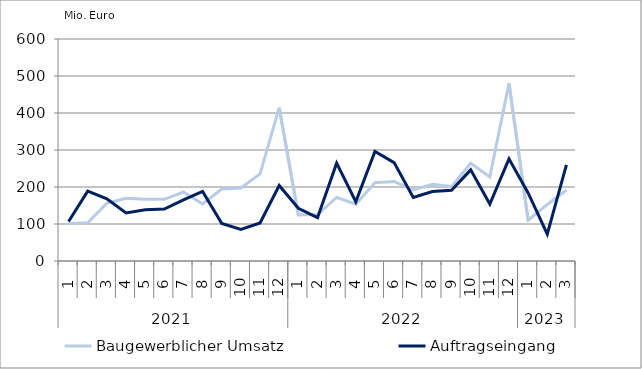
| Category | Baugewerblicher Umsatz | Auftragseingang |
|---|---|---|
| 0 | 101295.895 | 106850.127 |
| 1 | 103236.543 | 188883.434 |
| 2 | 156172.725 | 168204.42 |
| 3 | 169257.088 | 130052.073 |
| 4 | 166897.821 | 138492.214 |
| 5 | 166720.216 | 140262.426 |
| 6 | 186515.191 | 165331.191 |
| 7 | 154188.941 | 188169.655 |
| 8 | 194464.12 | 101359.538 |
| 9 | 197281.201 | 85626.862 |
| 10 | 235325.083 | 102880.924 |
| 11 | 414469.471 | 203900.676 |
| 12 | 124217.549 | 142351.759 |
| 13 | 125619.696 | 117194.423 |
| 14 | 171896.664 | 264509.013 |
| 15 | 153384.654 | 160146.519 |
| 16 | 211335.38 | 295997.826 |
| 17 | 214914.164 | 265813.917 |
| 18 | 192047.613 | 171529.517 |
| 19 | 207577.681 | 187809.656 |
| 20 | 201109.781 | 190941.096 |
| 21 | 264135.048 | 246250.021 |
| 22 | 227299.047 | 153783.993 |
| 23 | 480026.589 | 276019.328 |
| 24 | 110408.991 | 184068.731 |
| 25 | 152702.87 | 72330.186 |
| 26 | 191677.032 | 259741.102 |